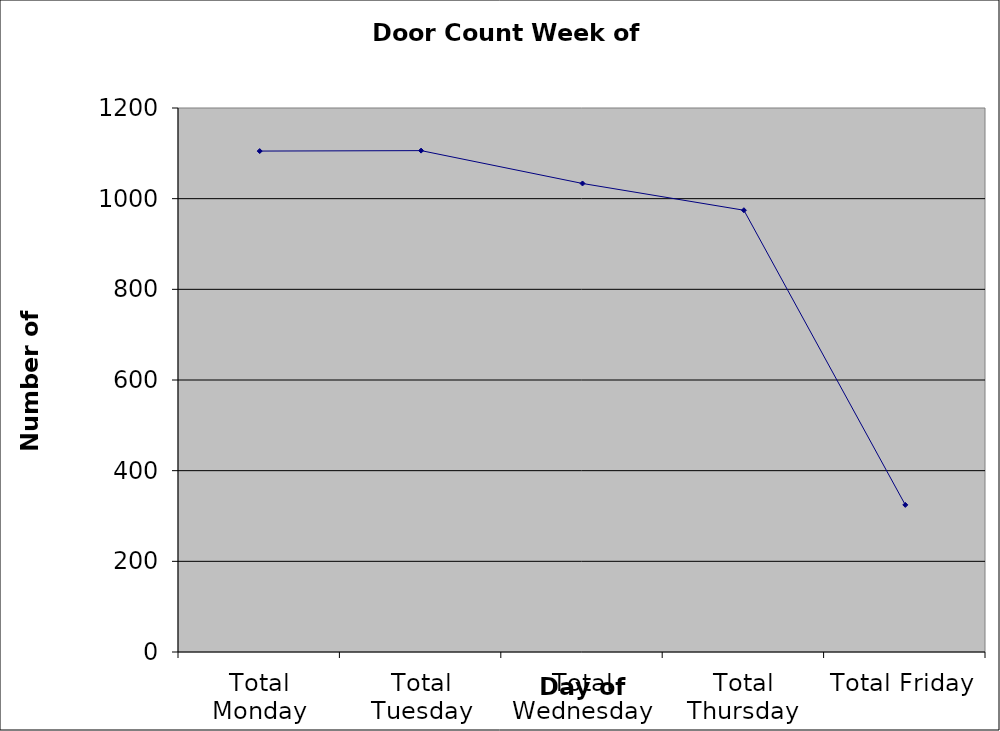
| Category | Series 0 |
|---|---|
| Total Monday | 1105 |
| Total Tuesday | 1106 |
| Total Wednesday | 1033.5 |
| Total Thursday | 974.5 |
| Total Friday | 324.5 |